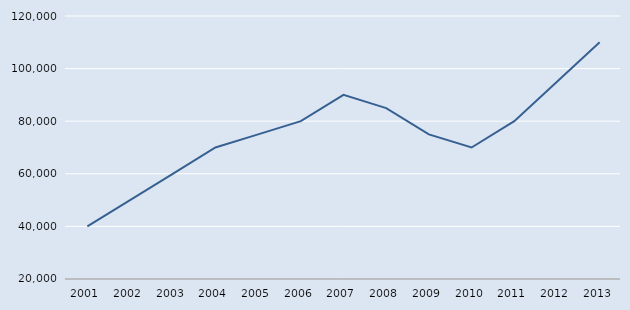
| Category | Series 1 |
|---|---|
| 2001.0 | 40000 |
| 2002.0 | 50000 |
| 2003.0 | 60000 |
| 2004.0 | 70000 |
| 2005.0 | 75000 |
| 2006.0 | 80000 |
| 2007.0 | 90000 |
| 2008.0 | 85000 |
| 2009.0 | 75000 |
| 2010.0 | 70000 |
| 2011.0 | 80000 |
| 2012.0 | 95000 |
| 2013.0 | 110000 |